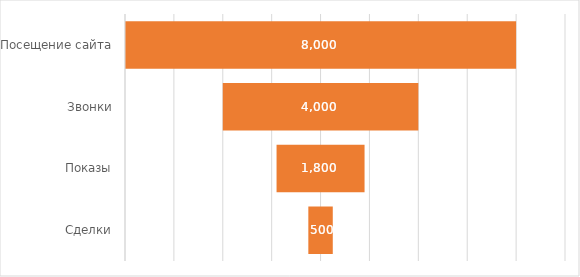
| Category | Отступ | Значение |
|---|---|---|
| Посещение сайта | 0 | 8000 |
| Звонки | 2000 | 4000 |
| Показы | 3100 | 1800 |
| Сделки | 3750 | 500 |